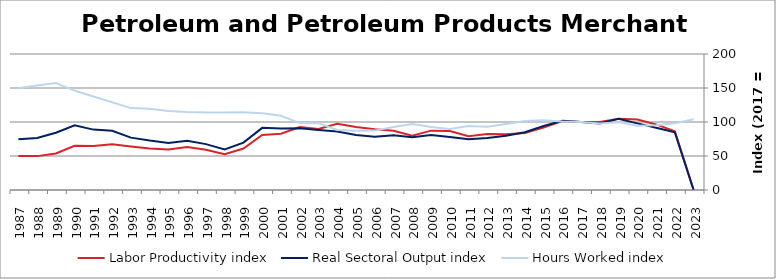
| Category | Labor Productivity index | Real Sectoral Output index | Hours Worked index |
|---|---|---|---|
| 2023.0 | 0 | 0 | 103.94 |
| 2022.0 | 86.393 | 84.699 | 98.039 |
| 2021.0 | 96.45 | 91.673 | 95.046 |
| 2020.0 | 103.573 | 97.949 | 94.569 |
| 2019.0 | 104.932 | 104.715 | 99.792 |
| 2018.0 | 100.036 | 97.732 | 97.697 |
| 2017.0 | 100 | 100 | 100 |
| 2016.0 | 101.228 | 101.949 | 100.712 |
| 2015.0 | 91.759 | 94.022 | 102.467 |
| 2014.0 | 83.701 | 85.061 | 101.625 |
| 2013.0 | 82.062 | 79.702 | 97.124 |
| 2012.0 | 82.433 | 76.547 | 92.859 |
| 2011.0 | 79.202 | 74.492 | 94.053 |
| 2010.0 | 86.689 | 77.843 | 89.796 |
| 2009.0 | 87.29 | 81.007 | 92.803 |
| 2008.0 | 79.968 | 77.504 | 96.919 |
| 2007.0 | 87.108 | 80.573 | 92.497 |
| 2006.0 | 89.505 | 78.164 | 87.329 |
| 2005.0 | 92.685 | 80.886 | 87.27 |
| 2004.0 | 97.403 | 85.995 | 88.288 |
| 2003.0 | 89.744 | 88.238 | 98.321 |
| 2002.0 | 92.467 | 90.954 | 98.364 |
| 2001.0 | 82.822 | 90.382 | 109.127 |
| 2000.0 | 80.998 | 91.388 | 112.828 |
| 1999.0 | 60.93 | 69.648 | 114.309 |
| 1998.0 | 52.464 | 59.701 | 113.796 |
| 1997.0 | 59.127 | 67.491 | 114.146 |
| 1996.0 | 63.246 | 72.457 | 114.564 |
| 1995.0 | 59.511 | 69.117 | 116.141 |
| 1994.0 | 60.953 | 72.722 | 119.308 |
| 1993.0 | 63.97 | 77.023 | 120.406 |
| 1992.0 | 67.427 | 86.981 | 129 |
| 1991.0 | 64.549 | 88.812 | 137.588 |
| 1990.0 | 65.03 | 95.031 | 146.134 |
| 1989.0 | 53.628 | 84.285 | 157.167 |
| 1988.0 | 49.823 | 76.482 | 153.508 |
| 1987.0 | 49.956 | 74.716 | 149.562 |